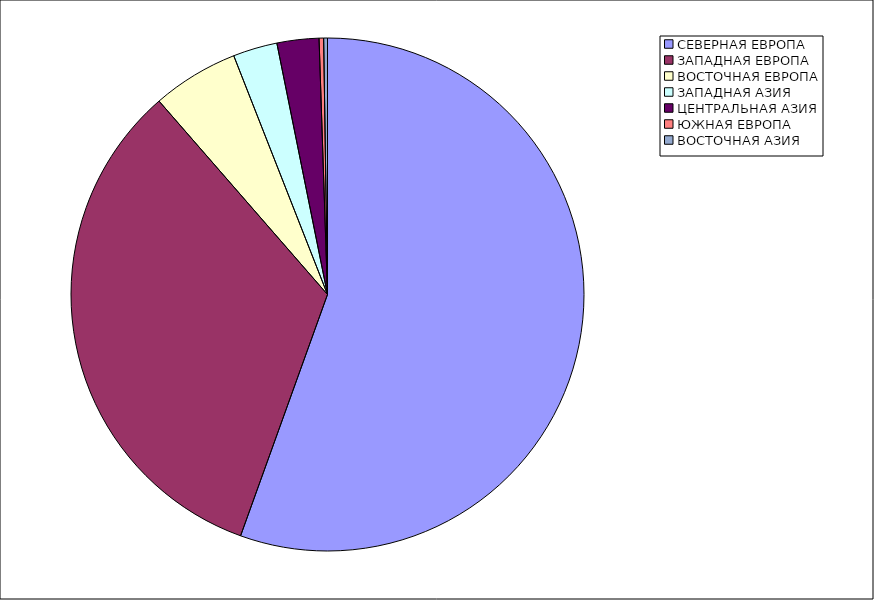
| Category | Оборот |
|---|---|
| СЕВЕРНАЯ ЕВРОПА | 55.502 |
| ЗАПАДНАЯ ЕВРОПА | 33.094 |
| ВОСТОЧНАЯ ЕВРОПА | 5.449 |
| ЗАПАДНАЯ АЗИЯ | 2.79 |
| ЦЕНТРАЛЬНАЯ АЗИЯ | 2.64 |
| ЮЖНАЯ ЕВРОПА | 0.285 |
| ВОСТОЧНАЯ АЗИЯ | 0.24 |